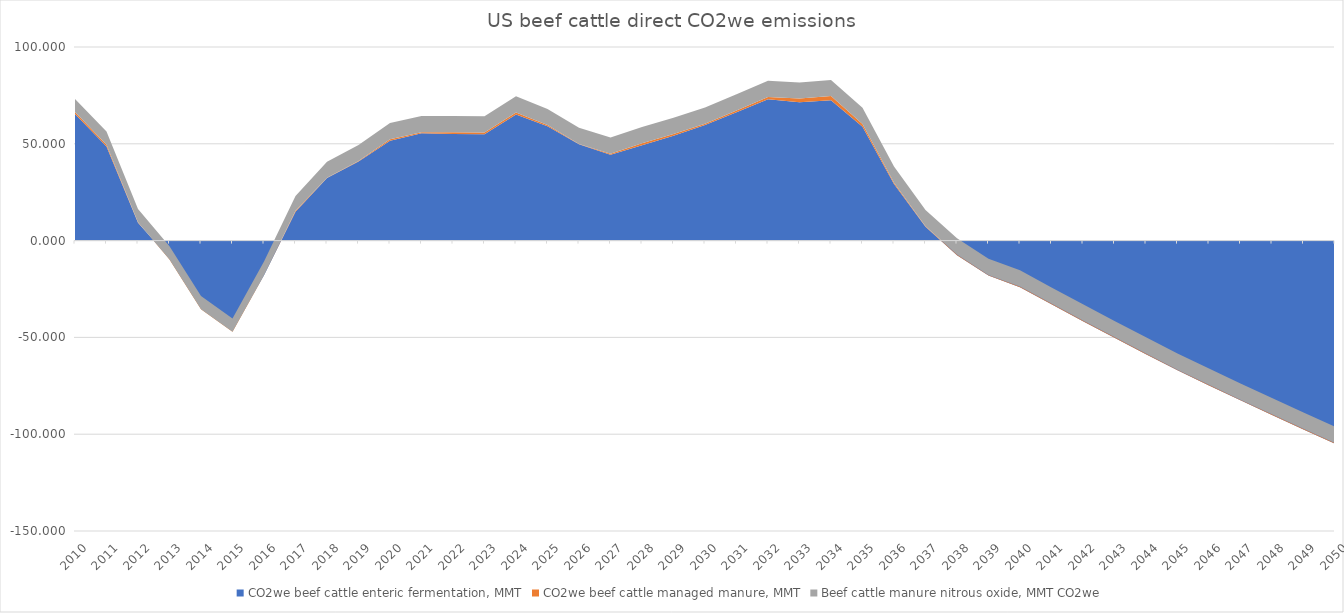
| Category | CO2we beef cattle enteric fermentation, MMT | CO2we beef cattle managed manure, MMT | Beef cattle manure nitrous oxide, MMT CO2we |
|---|---|---|---|
| 2010.0 | 65.374 | 1.084 | 6.704 |
| 2011.0 | 48.557 | 0.962 | 6.864 |
| 2012.0 | 9.258 | 0.239 | 6.837 |
| 2013.0 | -9.152 | -0.61 | 6.89 |
| 2014.0 | -34.033 | -1.449 | 6.89 |
| 2015.0 | -45.923 | -1.194 | 6.837 |
| 2016.0 | -17.841 | -0.106 | 7.208 |
| 2017.0 | 14.856 | 0.619 | 7.606 |
| 2018.0 | 32.326 | 0.14 | 8.215 |
| 2019.0 | 40.827 | 0.262 | 8.348 |
| 2020.0 | 51.545 | 0.854 | 8.348 |
| 2021.0 | 55.472 | 0.497 | 8.348 |
| 2022.0 | 55.115 | 0.854 | 8.348 |
| 2023.0 | 54.996 | 0.854 | 8.348 |
| 2024.0 | 65.111 | 1.092 | 8.348 |
| 2025.0 | 59.042 | 0.616 | 8.348 |
| 2026.0 | 49.806 | 0.14 | 8.348 |
| 2027.0 | 44.38 | 0.497 | 8.348 |
| 2028.0 | 49.309 | 0.973 | 8.348 |
| 2029.0 | 54.122 | 0.973 | 8.348 |
| 2030.0 | 59.65 | 0.735 | 8.348 |
| 2031.0 | 66.332 | 0.854 | 8.348 |
| 2032.0 | 72.96 | 1.211 | 8.348 |
| 2033.0 | 71.441 | 1.925 | 8.348 |
| 2034.0 | 72.486 | 2.163 | 8.348 |
| 2035.0 | 58.837 | 1.449 | 8.348 |
| 2036.0 | 29.187 | 0.735 | 8.348 |
| 2037.0 | 7.214 | 0.259 | 8.348 |
| 2038.0 | -7.557 | 0.378 | 8.348 |
| 2039.0 | -17.983 | 0.259 | 8.348 |
| 2040.0 | -24.065 | 0.378 | 8.348 |
| 2041.0 | -32.92 | 0.378 | 8.348 |
| 2042.0 | -41.642 | 0.378 | 8.348 |
| 2043.0 | -50.233 | 0.378 | 8.348 |
| 2044.0 | -58.696 | 0.378 | 8.348 |
| 2045.0 | -67.031 | 0.378 | 8.348 |
| 2046.0 | -74.838 | 0.378 | 8.348 |
| 2047.0 | -82.524 | 0.378 | 8.348 |
| 2048.0 | -90.091 | 0.378 | 8.348 |
| 2049.0 | -97.54 | 0.378 | 8.348 |
| 2050.0 | -104.874 | 0.378 | 8.348 |